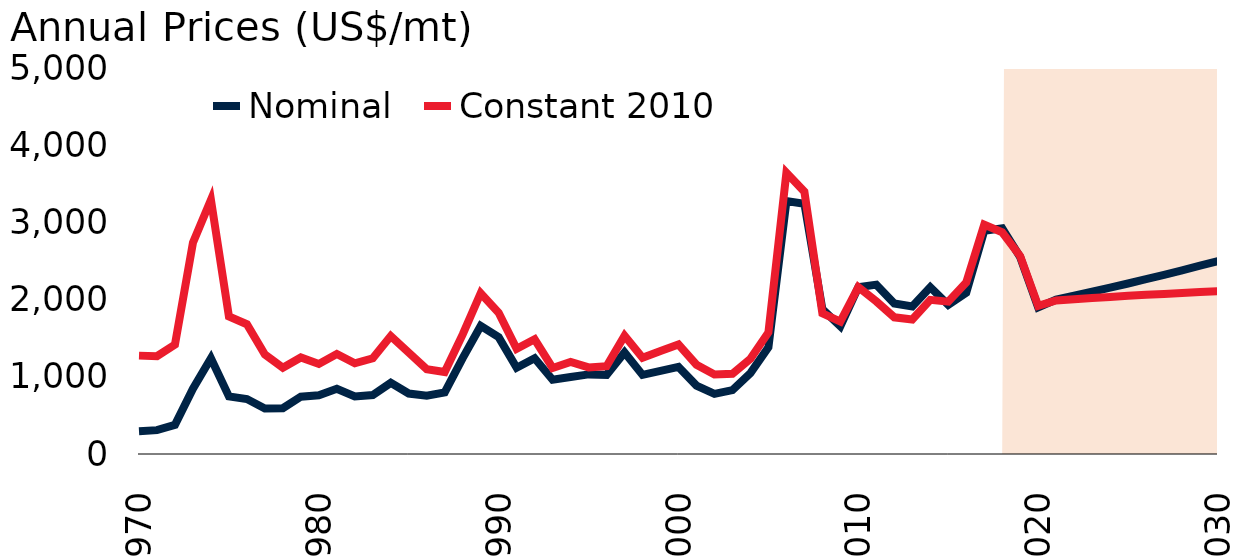
| Category | Nominal | Constant 2010 |
|---|---|---|
| 1970.0 | 295.817 | 1274.27 |
| 1971.0 | 309.283 | 1266.794 |
| 1972.0 | 377.692 | 1418.152 |
| 1973.0 | 845.333 | 2736.893 |
| 1974.0 | 1239.583 | 3293.266 |
| 1975.0 | 745.167 | 1782.574 |
| 1976.0 | 711.417 | 1681.202 |
| 1977.0 | 589.667 | 1289.106 |
| 1978.0 | 593.917 | 1117.273 |
| 1979.0 | 741.667 | 1250.732 |
| 1980.0 | 761.217 | 1167.074 |
| 1981.0 | 845.65 | 1295.046 |
| 1982.0 | 744.783 | 1175.591 |
| 1983.0 | 764.333 | 1239.314 |
| 1984.0 | 921.933 | 1528.49 |
| 1985.0 | 783.442 | 1312.57 |
| 1986.0 | 754.033 | 1098.362 |
| 1987.0 | 798.792 | 1061.796 |
| 1988.0 | 1241.508 | 1549.694 |
| 1989.0 | 1658.767 | 2083.011 |
| 1990.0 | 1513.458 | 1830.67 |
| 1991.0 | 1116.992 | 1363.646 |
| 1992.0 | 1239.775 | 1485.772 |
| 1993.0 | 961.983 | 1114.405 |
| 1994.0 | 997.725 | 1191.599 |
| 1995.0 | 1031.117 | 1121.754 |
| 1996.0 | 1025.142 | 1136.916 |
| 1997.0 | 1316.125 | 1531.765 |
| 1998.0 | 1024.467 | 1246.751 |
| 1999.0 | 1076.342 | 1335.554 |
| 2000.0 | 1128.133 | 1417.972 |
| 2001.0 | 885.767 | 1156.703 |
| 2002.0 | 778.75 | 1028.966 |
| 2003.0 | 827.695 | 1039.584 |
| 2004.0 | 1047.753 | 1232.273 |
| 2005.0 | 1381.306 | 1574.958 |
| 2006.0 | 3275.292 | 3642.201 |
| 2007.0 | 3242.358 | 3397.639 |
| 2008.0 | 1874.709 | 1823.045 |
| 2009.0 | 1655.114 | 1715.818 |
| 2010.0 | 2160.743 | 2160.743 |
| 2011.0 | 2193.9 | 1976.563 |
| 2012.0 | 1950.414 | 1770.284 |
| 2013.0 | 1910.256 | 1741.433 |
| 2014.0 | 2160.971 | 1996.878 |
| 2015.0 | 1931.678 | 1973.961 |
| 2016.0 | 2089.975 | 2222.582 |
| 2017.0 | 2890.867 | 2970.435 |
| 2018.0 | 2922.379 | 2871.279 |
| 2019.0 | 2550.41 | 2563.792 |
| 2020.0 | 1900 | 1919.395 |
| 2021.0 | 2000 | 1988.649 |
| 2022.0 | 2050.207 | 2004.973 |
| 2023.0 | 2101.675 | 2020.255 |
| 2024.0 | 2154.435 | 2034.691 |
| 2025.0 | 2208.519 | 2048.413 |
| 2026.0 | 2263.961 | 2061.511 |
| 2027.0 | 2320.794 | 2074.045 |
| 2028.0 | 2379.055 | 2086.06 |
| 2029.0 | 2438.778 | 2097.586 |
| 2030.0 | 2500 | 2108.642 |